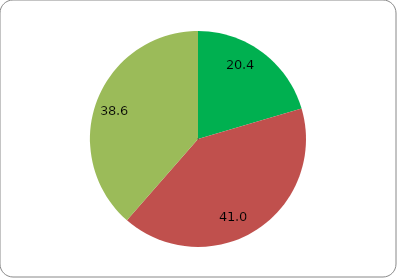
| Category | Series 0 |
|---|---|
| 0 | 20.435 |
| 1 | 40.992 |
| 2 | 38.573 |